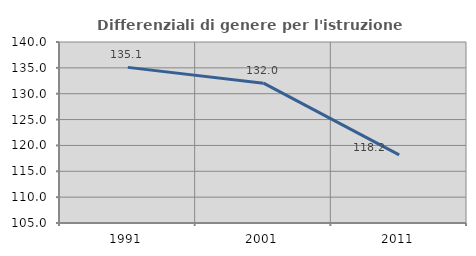
| Category | Differenziali di genere per l'istruzione superiore |
|---|---|
| 1991.0 | 135.092 |
| 2001.0 | 132.043 |
| 2011.0 | 118.165 |